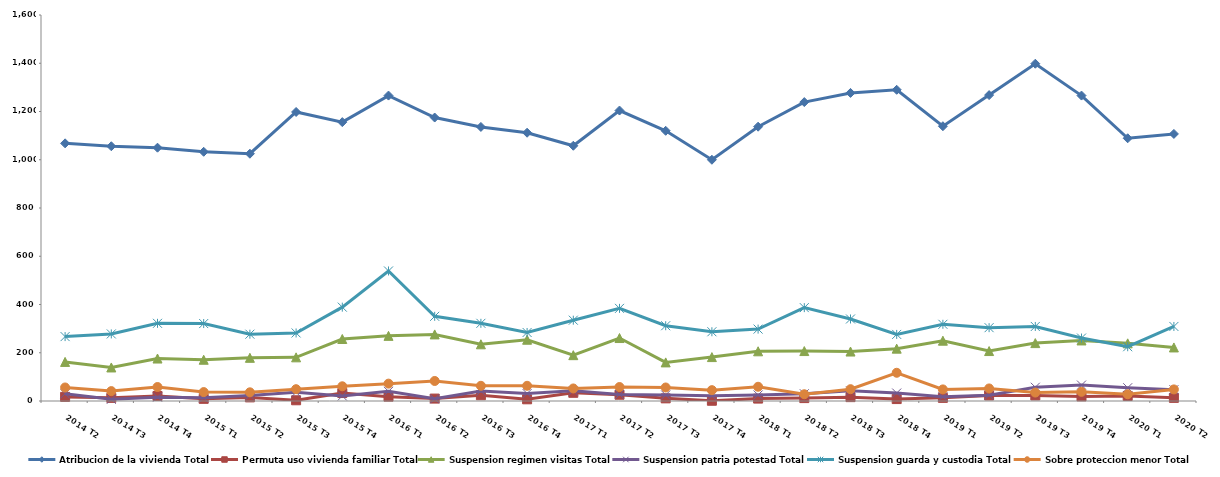
| Category | Atribucion de la vivienda Total | Permuta uso vivienda familiar Total | Suspension regimen visitas Total | Suspension patria potestad Total | Suspension guarda y custodia Total | Sobre proteccion menor Total |
|---|---|---|---|---|---|---|
| 2014 T2 | 1068 | 17 | 162 | 30 | 267 | 56 |
| 2014 T3 | 1056 | 13 | 139 | 7 | 278 | 41 |
| 2014 T4 | 1050 | 21 | 176 | 16 | 322 | 58 |
| 2015 T1 | 1033 | 9 | 171 | 13 | 321 | 37 |
| 2015 T2 | 1025 | 15 | 179 | 23 | 277 | 36 |
| 2015 T3 | 1198 | 3 | 181 | 36 | 282 | 49 |
| 2015 T4 | 1156 | 33 | 257 | 21 | 389 | 61 |
| 2016 T1 | 1266 | 18 | 270 | 40 | 539 | 72 |
| 2016 T2 | 1175 | 10 | 276 | 9 | 351 | 83 |
| 2016 T3 | 1136 | 24 | 235 | 41 | 322 | 63 |
| 2016 T4 | 1112 | 7 | 254 | 31 | 284 | 63 |
| 2017 T1 | 1058 | 34 | 190 | 42 | 335 | 52 |
| 2017 T2 | 1204 | 26 | 261 | 27 | 384 | 58 |
| 2017 T3 | 1120 | 11 | 160 | 25 | 312 | 56 |
| 2017 T4 | 1000 | 1 | 182 | 22 | 287 | 45 |
| 2018 T1 | 1137 | 10 | 206 | 25 | 298 | 59 |
| 2018 T2 | 1239 | 12 | 207 | 30 | 387 | 28 |
| 2018 T3 | 1277 | 16 | 205 | 42 | 340 | 49 |
| 2018 T4 | 1290 | 8 | 217 | 33 | 276 | 117 |
| 2019 T1 | 1139 | 13 | 250 | 18 | 318 | 48 |
| 2019 T2 | 1268 | 23 | 207 | 24 | 304 | 52 |
| 2019 T3 | 1398 | 23 | 240 | 57 | 309 | 35 |
| 2019 T4 | 1266 | 19 | 251 | 66 | 261 | 38 |
| 2020 T1 | 1089 | 21 | 239 | 55 | 225 | 28 |
| 2020 T2 | 1107 | 13 | 222 | 47 | 309 | 48 |